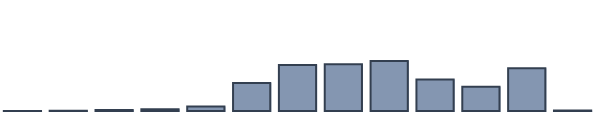
| Category | Series 0 |
|---|---|
| 0 | 0.033 |
| 1 | 0.047 |
| 2 | 0.322 |
| 3 | 0.643 |
| 4 | 1.623 |
| 5 | 10.133 |
| 6 | 16.595 |
| 7 | 16.888 |
| 8 | 18.052 |
| 9 | 11.346 |
| 10 | 8.764 |
| 11 | 15.385 |
| 12 | 0.169 |